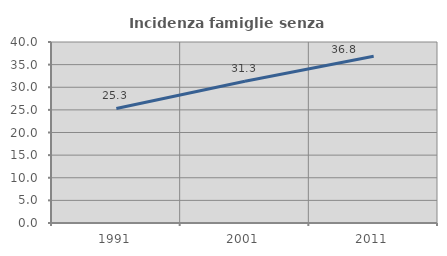
| Category | Incidenza famiglie senza nuclei |
|---|---|
| 1991.0 | 25.318 |
| 2001.0 | 31.327 |
| 2011.0 | 36.834 |